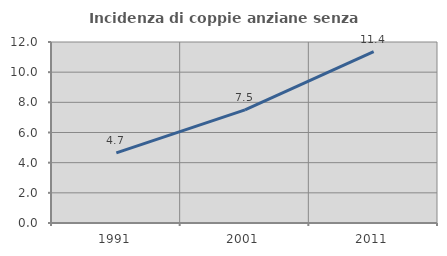
| Category | Incidenza di coppie anziane senza figli  |
|---|---|
| 1991.0 | 4.651 |
| 2001.0 | 7.5 |
| 2011.0 | 11.364 |